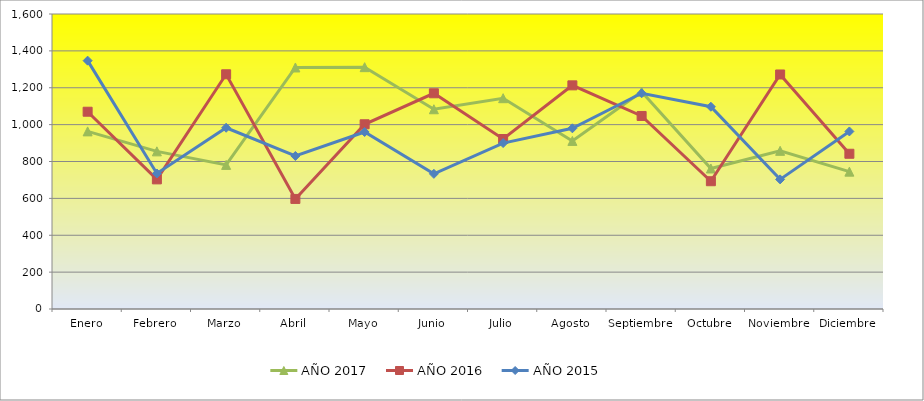
| Category | AÑO 2017 | AÑO 2016 | AÑO 2015 |
|---|---|---|---|
| Enero | 963.333 | 1070 | 1347 |
| Febrero | 855 | 703 | 735 |
| Marzo | 781.667 | 1273 | 983 |
| Abril | 1310 | 597 | 830 |
| Mayo | 1311.667 | 1002 | 960 |
| Junio | 1083.333 | 1170 | 733 |
| Julio | 1143.333 | 922 | 900 |
| Agosto | 911.667 | 1213 | 980 |
| Septiembre | 1178.333 | 1047 | 1170 |
| Octubre | 762.162 | 693 | 1097 |
| Noviembre | 857.838 | 1272 | 703 |
| Diciembre | 745 | 842 | 963 |